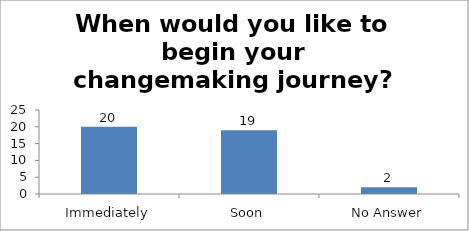
| Category | When would you like to begin your changemaking journey?  |
|---|---|
| Immediately | 20 |
| Soon | 19 |
| No Answer | 2 |